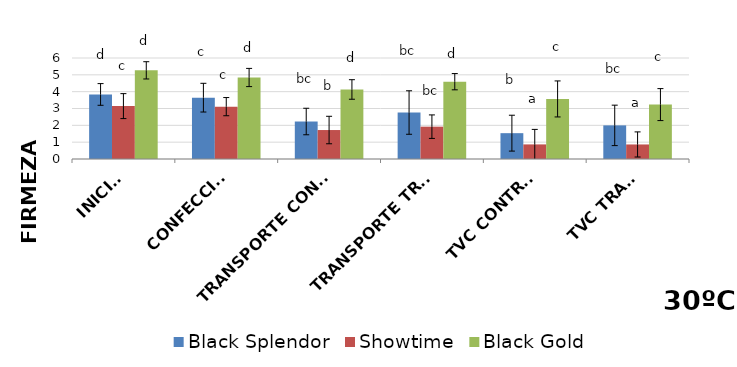
| Category | Black Splendor | Showtime | Black Gold |
|---|---|---|---|
| INICIAL | 3.835 | 3.142 | 5.267 |
| CONFECCIÓN | 3.643 | 3.11 | 4.842 |
|  TRANSPORTE CONTROL | 2.227 | 1.721 | 4.131 |
| TRANSPORTE TRAT. | 2.761 | 1.921 | 4.593 |
| TVC CONTROL | 1.535 | 0.867 | 3.568 |
| TVC TRAT. | 1.997 | 0.864 | 3.232 |